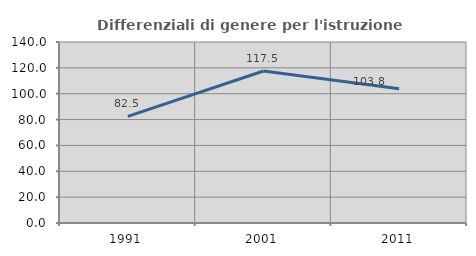
| Category | Differenziali di genere per l'istruzione superiore |
|---|---|
| 1991.0 | 82.481 |
| 2001.0 | 117.544 |
| 2011.0 | 103.78 |